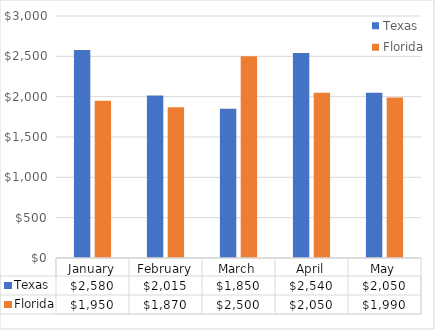
| Category | Texas | Florida |
|---|---|---|
| January | 2580 | 1950 |
| February | 2015 | 1870 |
| March | 1850 | 2500 |
| April | 2540 | 2050 |
| May | 2050 | 1990 |